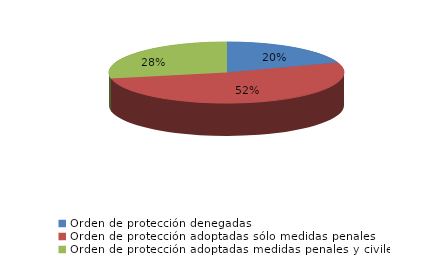
| Category | Series 0 |
|---|---|
| Orden de protección denegadas | 45 |
| Orden de protección adoptadas sólo medidas penales | 119 |
| Orden de protección adoptadas medidas penales y civiles | 64 |